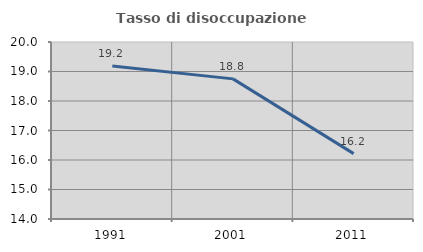
| Category | Tasso di disoccupazione giovanile  |
|---|---|
| 1991.0 | 19.186 |
| 2001.0 | 18.75 |
| 2011.0 | 16.216 |